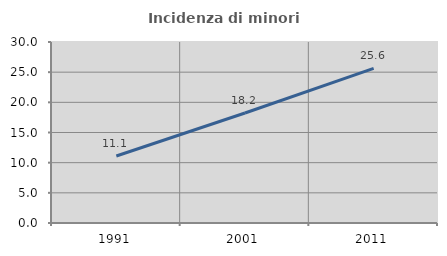
| Category | Incidenza di minori stranieri |
|---|---|
| 1991.0 | 11.111 |
| 2001.0 | 18.225 |
| 2011.0 | 25.622 |